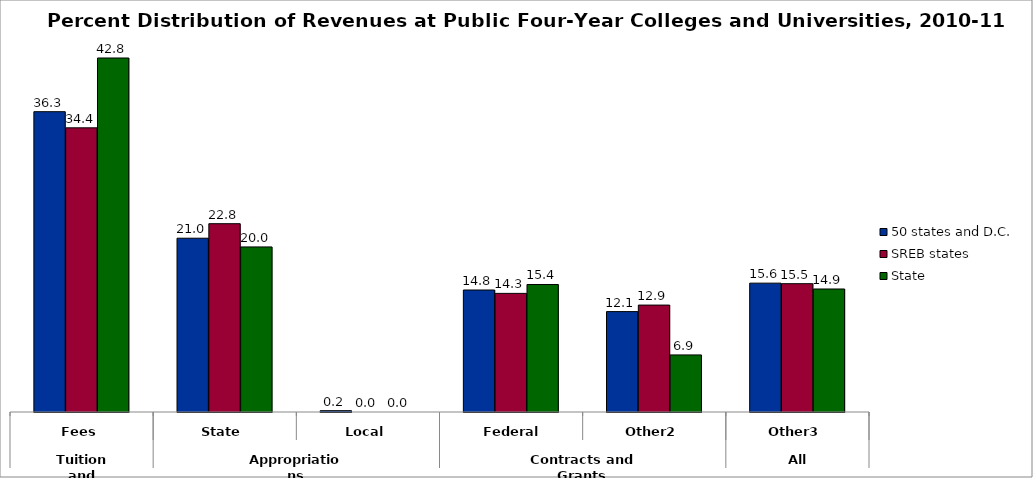
| Category | 50 states and D.C. | SREB states | State |
|---|---|---|---|
| 0 | 36.329 | 34.374 | 42.823 |
| 1 | 21.023 | 22.778 | 19.969 |
| 2 | 0.159 | 0 | 0 |
| 3 | 14.756 | 14.349 | 15.424 |
| 4 | 12.145 | 12.933 | 6.904 |
| 5 | 15.587 | 15.522 | 14.88 |